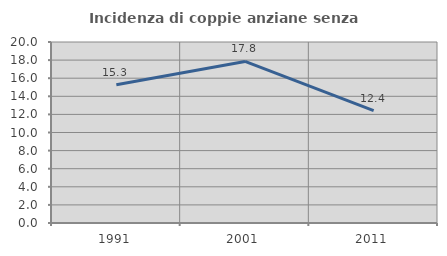
| Category | Incidenza di coppie anziane senza figli  |
|---|---|
| 1991.0 | 15.287 |
| 2001.0 | 17.85 |
| 2011.0 | 12.422 |